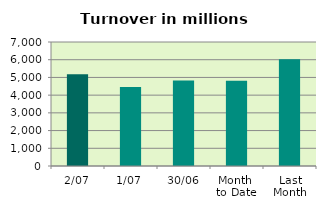
| Category | Series 0 |
|---|---|
| 2/07 | 5178.425 |
| 1/07 | 4455.251 |
| 30/06 | 4830.059 |
| Month 
to Date | 4816.838 |
| Last
Month | 6026.772 |